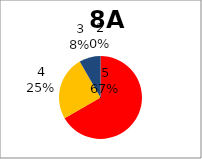
| Category | Series 0 |
|---|---|
| 5.0 | 8 |
| 4.0 | 3 |
| 3.0 | 1 |
| 2.0 | 0 |